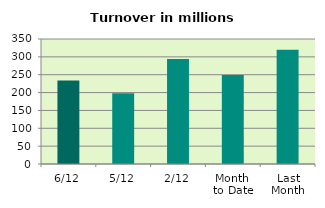
| Category | Series 0 |
|---|---|
| 6/12 | 233.576 |
| 5/12 | 198.051 |
| 2/12 | 294.234 |
| Month 
to Date | 248.993 |
| Last
Month | 319.611 |